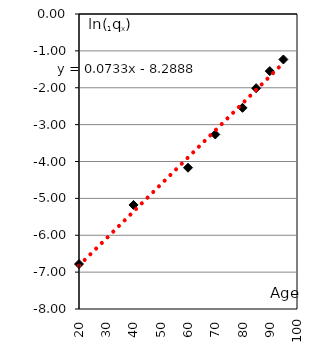
| Category | Series 0 |
|---|---|
| 20.0 | -6.78 |
| 40.0 | -5.178 |
| 60.0 | -4.169 |
| 70.0 | -3.267 |
| 80.0 | -2.544 |
| 85.0 | -2.012 |
| 90.0 | -1.548 |
| 95.0 | -1.233 |